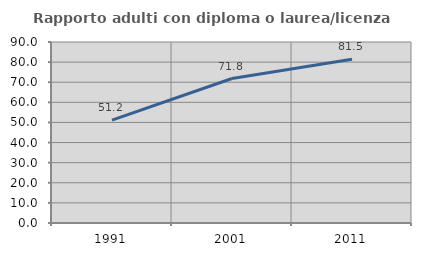
| Category | Rapporto adulti con diploma o laurea/licenza media  |
|---|---|
| 1991.0 | 51.163 |
| 2001.0 | 71.834 |
| 2011.0 | 81.466 |